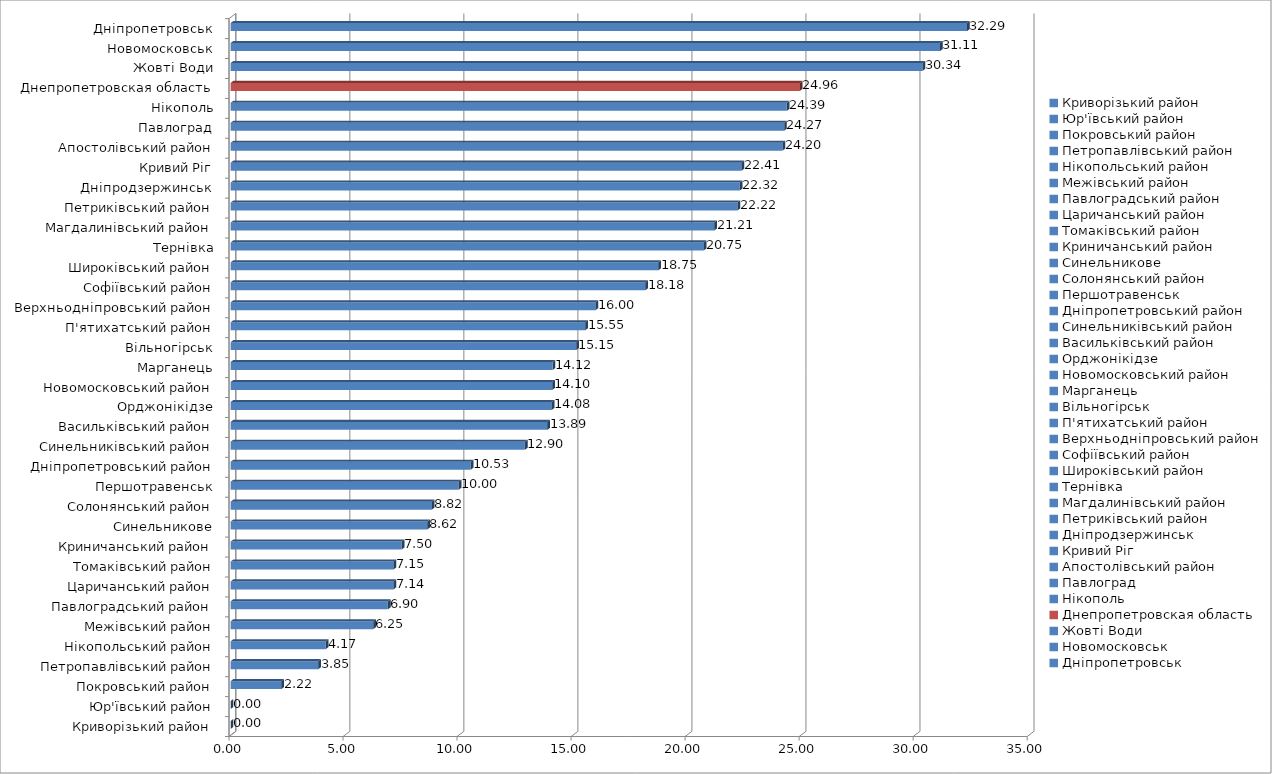
| Category | [160;200) |
|---|---|
| Криворізький район | 0 |
| Юр'ївський район | 0 |
| Покровський район | 2.223 |
| Петропавлівський район | 3.846 |
| Нікопольський район | 4.168 |
| Межівський район | 6.25 |
| Павлоградський район | 6.896 |
| Царичанський район | 7.143 |
| Томаківський район | 7.145 |
| Криничанський район | 7.5 |
| Синельникове | 8.619 |
| Солонянський район | 8.823 |
| Першотравенськ | 10.002 |
| Дніпропетровський район | 10.526 |
| Синельниківський район | 12.904 |
| Васильківський район | 13.888 |
| Орджонікідзе | 14.083 |
| Новомосковський район | 14.1 |
| Марганець | 14.119 |
| Вільногірськ | 15.155 |
| П'ятихатський район | 15.553 |
| Верхньодніпровський район | 15.999 |
| Софіївський район | 18.182 |
| Широківський район | 18.752 |
| Тернівка | 20.75 |
| Магдалинівський район | 21.21 |
| Петриківський район | 22.223 |
| Дніпродзержинськ | 22.323 |
| Кривий Ріг | 22.405 |
| Апостолівський район | 24.196 |
| Павлоград | 24.271 |
| Нікополь | 24.391 |
| Днепропетровская область | 24.96 |
| Жовті Води | 30.335 |
| Новомосковськ | 31.109 |
| Дніпропетровськ | 32.293 |